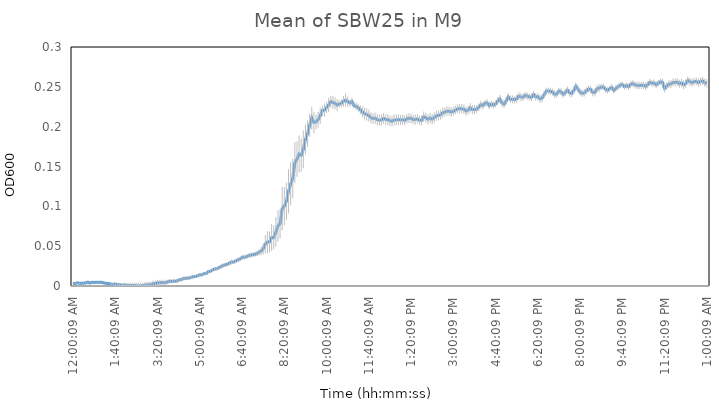
| Category | SBW25 (WT) |
|---|---|
| 0.00010416666666666667 | 0.003 |
| 0.0035763888888888894 | 0.003 |
| 0.0070486111111111105 | 0.004 |
| 0.010520833333333333 | 0.004 |
| 0.013993055555555555 | 0.003 |
| 0.017465277777777777 | 0.004 |
| 0.020937499999999998 | 0.004 |
| 0.02440972222222222 | 0.005 |
| 0.027881944444444445 | 0.004 |
| 0.03135416666666666 | 0.005 |
| 0.034826388888888886 | 0.004 |
| 0.03829861111111111 | 0.005 |
| 0.04177083333333333 | 0.004 |
| 0.04524305555555556 | 0.005 |
| 0.04871527777777778 | 0.004 |
| 0.0521875 | 0.004 |
| 0.05565972222222223 | 0.003 |
| 0.059131944444444445 | 0.003 |
| 0.06260416666666667 | 0.002 |
| 0.06607638888888889 | 0.002 |
| 0.06954861111111112 | 0.002 |
| 0.07302083333333333 | 0.002 |
| 0.07649305555555556 | 0.002 |
| 0.07996527777777777 | 0.001 |
| 0.0834375 | 0.001 |
| 0.08690972222222222 | 0.001 |
| 0.09038194444444443 | 0.001 |
| 0.09385416666666667 | 0.001 |
| 0.09732638888888889 | 0 |
| 0.1007986111111111 | 0.001 |
| 0.10427083333333333 | 0 |
| 0.10774305555555556 | 0 |
| 0.11121527777777777 | 0 |
| 0.1146875 | 0 |
| 0.11815972222222222 | 0.001 |
| 0.12163194444444443 | 0.001 |
| 0.12510416666666666 | 0.002 |
| 0.1285763888888889 | 0.002 |
| 0.1320486111111111 | 0.003 |
| 0.13552083333333334 | 0.003 |
| 0.13899305555555555 | 0.004 |
| 0.14246527777777776 | 0.004 |
| 0.1459375 | 0.005 |
| 0.14940972222222224 | 0.004 |
| 0.15288194444444445 | 0.004 |
| 0.15635416666666666 | 0.005 |
| 0.1598263888888889 | 0.006 |
| 0.1632986111111111 | 0.006 |
| 0.16677083333333334 | 0.006 |
| 0.17024305555555555 | 0.006 |
| 0.17371527777777776 | 0.008 |
| 0.17718750000000003 | 0.008 |
| 0.18065972222222224 | 0.009 |
| 0.18413194444444445 | 0.01 |
| 0.18760416666666666 | 0.01 |
| 0.1910763888888889 | 0.01 |
| 0.1945486111111111 | 0.011 |
| 0.1980208333333333 | 0.012 |
| 0.20149305555555555 | 0.012 |
| 0.20496527777777776 | 0.013 |
| 0.20843750000000003 | 0.014 |
| 0.21190972222222224 | 0.014 |
| 0.21538194444444445 | 0.016 |
| 0.21885416666666668 | 0.016 |
| 0.2223263888888889 | 0.018 |
| 0.2257986111111111 | 0.018 |
| 0.2292708333333333 | 0.02 |
| 0.23274305555555555 | 0.021 |
| 0.23621527777777776 | 0.022 |
| 0.23968749999999997 | 0.023 |
| 0.24315972222222224 | 0.024 |
| 0.24663194444444445 | 0.026 |
| 0.2501041666666667 | 0.027 |
| 0.2535763888888889 | 0.027 |
| 0.2570486111111111 | 0.029 |
| 0.26052083333333337 | 0.03 |
| 0.2639930555555556 | 0.03 |
| 0.2674652777777778 | 0.031 |
| 0.27092592592592596 | 0.033 |
| 0.2744097222222222 | 0.034 |
| 0.2778819444444444 | 0.036 |
| 0.2813541666666666 | 0.036 |
| 0.2848263888888889 | 0.037 |
| 0.2882986111111111 | 0.038 |
| 0.29177083333333337 | 0.039 |
| 0.2952430555555556 | 0.039 |
| 0.2987152777777778 | 0.04 |
| 0.3021875 | 0.041 |
| 0.3056597222222222 | 0.042 |
| 0.3091319444444444 | 0.044 |
| 0.3126041666666666 | 0.047 |
| 0.3160763888888889 | 0.052 |
| 0.3195486111111111 | 0.055 |
| 0.3230208333333333 | 0.055 |
| 0.3264930555555556 | 0.061 |
| 0.3299652777777778 | 0.061 |
| 0.3334375 | 0.068 |
| 0.3369097222222222 | 0.075 |
| 0.3403819444444445 | 0.078 |
| 0.3438541666666666 | 0.097 |
| 0.3473263888888889 | 0.1 |
| 0.35079861111111116 | 0.106 |
| 0.3542708333333333 | 0.119 |
| 0.3577430555555556 | 0.128 |
| 0.3612152777777778 | 0.135 |
| 0.3646875 | 0.155 |
| 0.3681597222222222 | 0.159 |
| 0.3716319444444445 | 0.166 |
| 0.3751041666666666 | 0.164 |
| 0.3785763888888889 | 0.172 |
| 0.38204861111111116 | 0.184 |
| 0.3855208333333333 | 0.191 |
| 0.3889930555555556 | 0.202 |
| 0.3924652777777778 | 0.211 |
| 0.3959375 | 0.205 |
| 0.3994097222222222 | 0.206 |
| 0.4028819444444445 | 0.209 |
| 0.4063541666666666 | 0.214 |
| 0.4098263888888889 | 0.22 |
| 0.41329861111111116 | 0.221 |
| 0.4167708333333333 | 0.224 |
| 0.4202430555555556 | 0.227 |
| 0.4237152777777778 | 0.231 |
| 0.4271875 | 0.23 |
| 0.4306597222222222 | 0.229 |
| 0.4341319444444445 | 0.227 |
| 0.4376041666666666 | 0.229 |
| 0.4410763888888889 | 0.229 |
| 0.44454861111111116 | 0.232 |
| 0.4480208333333333 | 0.233 |
| 0.4514930555555556 | 0.231 |
| 0.4549652777777778 | 0.23 |
| 0.4584375 | 0.232 |
| 0.4619097222222222 | 0.226 |
| 0.4653819444444445 | 0.226 |
| 0.4688541666666666 | 0.224 |
| 0.4723263888888889 | 0.221 |
| 0.47579861111111116 | 0.218 |
| 0.4792708333333333 | 0.216 |
| 0.4827430555555556 | 0.215 |
| 0.4862152777777778 | 0.214 |
| 0.4896875 | 0.211 |
| 0.4931597222222222 | 0.21 |
| 0.4966319444444445 | 0.211 |
| 0.5001041666666667 | 0.209 |
| 0.5035763888888889 | 0.208 |
| 0.5070486111111111 | 0.209 |
| 0.5105208333333333 | 0.21 |
| 0.5139930555555555 | 0.209 |
| 0.5174652777777778 | 0.209 |
| 0.5209374999999999 | 0.207 |
| 0.5244097222222223 | 0.207 |
| 0.5278819444444445 | 0.208 |
| 0.5313541666666667 | 0.209 |
| 0.5348263888888889 | 0.209 |
| 0.5382986111111111 | 0.208 |
| 0.5417708333333333 | 0.209 |
| 0.5452430555555555 | 0.208 |
| 0.5487152777777778 | 0.21 |
| 0.5521874999999999 | 0.211 |
| 0.5556597222222223 | 0.211 |
| 0.5591319444444445 | 0.209 |
| 0.5626041666666667 | 0.209 |
| 0.5660763888888889 | 0.21 |
| 0.5695486111111111 | 0.208 |
| 0.5730208333333333 | 0.208 |
| 0.5764930555555555 | 0.212 |
| 0.5799652777777778 | 0.211 |
| 0.5834374999999999 | 0.209 |
| 0.5869097222222223 | 0.211 |
| 0.5903819444444445 | 0.209 |
| 0.5938541666666667 | 0.211 |
| 0.5973263888888889 | 0.214 |
| 0.6007986111111111 | 0.214 |
| 0.6042708333333333 | 0.215 |
| 0.6077430555555555 | 0.217 |
| 0.6112152777777778 | 0.218 |
| 0.6146874999999999 | 0.219 |
| 0.6181597222222223 | 0.219 |
| 0.6216319444444445 | 0.218 |
| 0.6251041666666667 | 0.219 |
| 0.6285763888888889 | 0.221 |
| 0.6320486111111111 | 0.222 |
| 0.6355208333333333 | 0.223 |
| 0.6389930555555555 | 0.222 |
| 0.6424652777777778 | 0.222 |
| 0.6459374999999999 | 0.22 |
| 0.6494097222222223 | 0.221 |
| 0.6528819444444445 | 0.224 |
| 0.6563541666666667 | 0.221 |
| 0.6598263888888889 | 0.221 |
| 0.6632986111111111 | 0.222 |
| 0.6667708333333334 | 0.224 |
| 0.6702430555555555 | 0.227 |
| 0.6737152777777777 | 0.227 |
| 0.6771875 | 0.229 |
| 0.6806597222222223 | 0.23 |
| 0.6841319444444444 | 0.226 |
| 0.6876041666666667 | 0.228 |
| 0.6910763888888889 | 0.227 |
| 0.6945486111111111 | 0.229 |
| 0.6980208333333334 | 0.232 |
| 0.7014930555555555 | 0.235 |
| 0.7049652777777777 | 0.23 |
| 0.7084375 | 0.228 |
| 0.7119097222222223 | 0.232 |
| 0.7153819444444444 | 0.237 |
| 0.7188541666666667 | 0.235 |
| 0.7223263888888889 | 0.234 |
| 0.7257986111111111 | 0.234 |
| 0.7292708333333334 | 0.235 |
| 0.7327430555555555 | 0.238 |
| 0.7362152777777777 | 0.237 |
| 0.7396875 | 0.237 |
| 0.7431597222222223 | 0.239 |
| 0.7466319444444444 | 0.238 |
| 0.7501041666666667 | 0.237 |
| 0.7535763888888889 | 0.237 |
| 0.7570486111111111 | 0.24 |
| 0.7605208333333334 | 0.237 |
| 0.7639930555555555 | 0.237 |
| 0.7674652777777777 | 0.235 |
| 0.7709375 | 0.236 |
| 0.7744097222222223 | 0.24 |
| 0.7778819444444444 | 0.245 |
| 0.7813541666666667 | 0.245 |
| 0.7848263888888889 | 0.244 |
| 0.7882986111111111 | 0.243 |
| 0.7917708333333334 | 0.241 |
| 0.7952430555555555 | 0.241 |
| 0.7987152777777777 | 0.245 |
| 0.8021875 | 0.244 |
| 0.8056597222222223 | 0.241 |
| 0.8091319444444444 | 0.243 |
| 0.8126041666666667 | 0.246 |
| 0.8160763888888889 | 0.243 |
| 0.8195486111111111 | 0.242 |
| 0.8230208333333334 | 0.245 |
| 0.8264930555555555 | 0.251 |
| 0.8299652777777777 | 0.247 |
| 0.8334375 | 0.243 |
| 0.8369097222222223 | 0.242 |
| 0.8403819444444444 | 0.242 |
| 0.8438541666666667 | 0.245 |
| 0.8473263888888889 | 0.247 |
| 0.8507986111111111 | 0.247 |
| 0.8542708333333334 | 0.243 |
| 0.8577430555555555 | 0.243 |
| 0.8612152777777777 | 0.248 |
| 0.8646875 | 0.248 |
| 0.8681597222222223 | 0.25 |
| 0.8716319444444444 | 0.25 |
| 0.8751041666666667 | 0.247 |
| 0.8785763888888889 | 0.246 |
| 0.8820486111111111 | 0.248 |
| 0.8855208333333334 | 0.249 |
| 0.8889930555555555 | 0.246 |
| 0.8924652777777777 | 0.248 |
| 0.8959375 | 0.25 |
| 0.8994097222222223 | 0.252 |
| 0.9028819444444444 | 0.253 |
| 0.9063541666666667 | 0.25 |
| 0.9098263888888889 | 0.252 |
| 0.9132986111111111 | 0.25 |
| 0.9167708333333334 | 0.253 |
| 0.9202430555555555 | 0.254 |
| 0.9237152777777777 | 0.252 |
| 0.9271875 | 0.252 |
| 0.9306597222222223 | 0.252 |
| 0.9341319444444444 | 0.252 |
| 0.9376041666666667 | 0.252 |
| 0.9410763888888889 | 0.251 |
| 0.9445486111111111 | 0.253 |
| 0.9480208333333334 | 0.256 |
| 0.9514930555555555 | 0.254 |
| 0.9549652777777777 | 0.255 |
| 0.9584375 | 0.253 |
| 0.9619097222222223 | 0.255 |
| 0.9653819444444444 | 0.256 |
| 0.9688541666666667 | 0.256 |
| 0.9723263888888889 | 0.248 |
| 0.9757986111111111 | 0.251 |
| 0.9792708333333334 | 0.253 |
| 0.9827430555555555 | 0.254 |
| 0.9862152777777777 | 0.256 |
| 0.9896875 | 0.256 |
| 0.9931597222222223 | 0.256 |
| 0.9966319444444444 | 0.254 |
| 1900-01-01 00:00:09 | 0.255 |
| 1900-01-01 00:05:09 | 0.253 |
| 1900-01-01 00:10:09 | 0.254 |
| 1900-01-01 00:15:09 | 0.258 |
| 1900-01-01 00:20:09 | 0.256 |
| 1900-01-01 00:25:09 | 0.255 |
| 1900-01-01 00:30:09 | 0.257 |
| 1900-01-01 00:35:09 | 0.257 |
| 1900-01-01 00:40:09 | 0.255 |
| 1900-01-01 00:45:09 | 0.257 |
| 1900-01-01 00:50:09 | 0.257 |
| 1900-01-01 00:55:09 | 0.255 |
| 1900-01-01 01:00:09 | 0.254 |